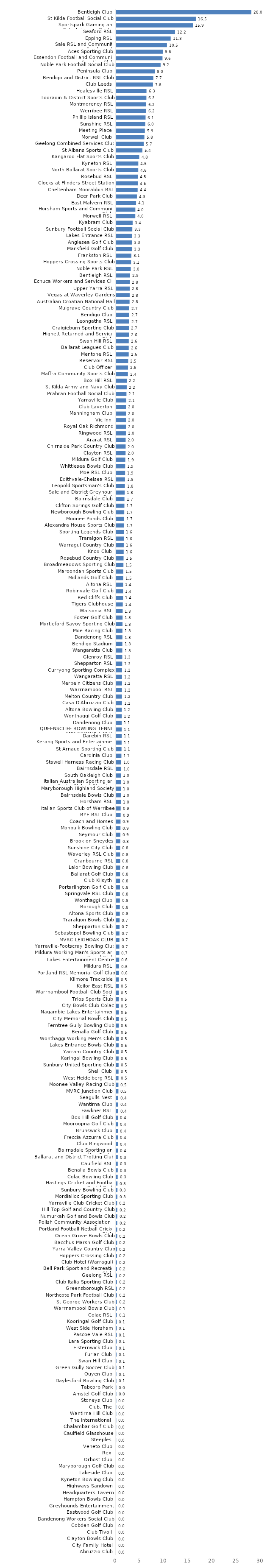
| Category | Series 0 |
|---|---|
| Abruzzio Club | 0 |
| City Family Hotel | 0 |
| Clayton Bowls Club | 0 |
| Club Tivoli | 0 |
| Cobden Golf Club | 0 |
| Dandenong Workers Social Club | 0 |
| Eastwood Golf Club | 0 |
| Greyhounds Entertainment | 0 |
| Hampton Bowls Club | 0 |
| Headquarters Tavern | 0 |
| Highways Sandown | 0 |
| Kyneton Bowling Club | 0 |
| Lakeside Club | 0 |
| Maryborough Golf Club | 0 |
| Orbost Club | 0 |
| Rex | 0 |
| Veneto Club | 0 |
| Steeples | 0.014 |
| Caulfield Glasshouse | 0.015 |
| Chalambar Golf Club | 0.024 |
| The International  | 0.029 |
| Wantirna Hill Club | 0.031 |
| Club, The | 0.034 |
| Stoneys Club | 0.035 |
| Amstel Golf Club | 0.046 |
| Tabcorp Park | 0.049 |
| Daylesford Bowling Club | 0.052 |
| Ouyen Club | 0.052 |
| Green Gully Soccer Club | 0.059 |
| Swan Hill Club | 0.068 |
| Furlan Club | 0.082 |
| Elsternwick Club | 0.091 |
| Lara Sporting Club | 0.111 |
| Pascoe Vale RSL | 0.124 |
| West Side Horsham | 0.124 |
| Kooringal Golf Club | 0.129 |
| Colac RSL | 0.134 |
| Warrnambool Bowls Club | 0.14 |
| St George Workers Club | 0.158 |
| Northcote Park Football Club | 0.158 |
| Greensborough RSL | 0.161 |
| Club Italia Sporting Club | 0.162 |
| Geelong RSL | 0.174 |
| Bell Park Sport and Recreation Club | 0.175 |
| Club Hotel (Warragul) | 0.177 |
| Hoppers Crossing Club | 0.186 |
| Yarra Valley Country Club | 0.197 |
| Bacchus Marsh Golf Club | 0.205 |
| Ocean Grove Bowls Club | 0.215 |
| Portland Football Netball Cricket Club | 0.219 |
| Polish Community Association in Geelong | 0.229 |
| Numurkah Golf and Bowls Club | 0.237 |
| Hill Top Golf and Country Club | 0.239 |
| Yarraville Club Cricket Club | 0.2 |
| Mordialloc Sporting Club | 0.257 |
| Sunbury Bowling Club | 0.275 |
| Hastings Cricket and Football Social Club | 0.278 |
| Colac Bowling Club | 0.319 |
| Benalla Bowls Club | 0.329 |
| Caulfield RSL | 0.33 |
| Ballarat and District Trotting Club | 0.34 |
| Bairnsdale Sporting and Convention Centre | 0.358 |
| Club Ringwood | 0.359 |
| Freccia Azzurra Club | 0.362 |
| Brunswick Club | 0.368 |
| Mooroopna Golf Club | 0.381 |
| Box Hill Golf Club | 0.385 |
| Fawkner RSL | 0.405 |
| Wantirna Club | 0.43 |
| Seagulls Nest | 0.433 |
| MVRC Junction Club | 0.471 |
| Moonee Valley Racing Club | 0.471 |
| West Heidelberg RSL | 0.484 |
| Shell Club | 0.495 |
| Sunbury United Sporting Club | 0.505 |
| Karingal Bowling Club | 0.512 |
| Yarram Country Club | 0.517 |
| Lakes Entrance Bowls Club | 0.519 |
| Wonthaggi Working Men's Club | 0.527 |
| Benalla Golf Club | 0.5 |
| Ferntree Gully Bowling Club | 0.53 |
| City Memorial Bowls Club | 0.534 |
| Nagambie Lakes Entertainment Centre | 0.536 |
| City Bowls Club Colac | 0.537 |
| Trios Sports Club | 0.542 |
| Warrnambool Football Club Social Club | 0.543 |
| Keilor East RSL | 0.545 |
| Kilmore Trackside | 0.547 |
| Portland RSL Memorial Golf Club | 0.601 |
| Mildura RSL | 0.611 |
| Lakes Entertainment Centre | 0.634 |
| Mildura Working Man's Sports and Social Club | 0.653 |
| Yarraville-Footscray Bowling Club | 0.666 |
| MVRC LEIGHOAK CLUB | 0.683 |
| Sebastopol Bowling Club | 0.688 |
| Shepparton Club | 0.709 |
| Traralgon Bowls Club | 0.721 |
| Altona Sports Club | 0.755 |
| Borough Club | 0.756 |
| Wonthaggi Club | 0.772 |
| Springvale RSL Club | 0.775 |
| Portarlington Golf Club | 0.786 |
| Club Kilsyth | 0.799 |
| Ballarat Golf Club | 0.807 |
| Lalor Bowling Club | 0.822 |
| Cranbourne RSL | 0.822 |
| Waverley RSL Club | 0.824 |
| Sunshine City Club | 0.826 |
| Brook on Sneydes | 0.85 |
| Seymour Club | 0.879 |
| Monbulk Bowling Club | 0.893 |
| Coach and Horses | 0.911 |
| RYE RSL Club | 0.931 |
| Italian Sports Club of Werribee | 0.935 |
| Horsham RSL | 0.981 |
| Bairnsdale Bowls Club | 0.985 |
| Maryborough Highland Society | 0.986 |
| Italian Australian Sporting and Social Club of Gippsland | 0.993 |
| South Oakleigh Club | 1 |
| Bairnsdale RSL | 1.026 |
| Stawell Harness Racing Club | 1.048 |
| Cardinia Club | 1.086 |
| St Arnaud Sporting Club | 1.111 |
| Kerang Sports and Entertainment Venue | 1.128 |
| Darebin RSL | 1.142 |
| QUEENSCLIFF BOWLING TENNIS AND CROQUET CLUB | 1.146 |
| Dandenong Club | 1.147 |
| Wonthaggi Golf Club | 1.16 |
| Altona Bowling Club | 1.173 |
| Casa D'Abruzzio Club | 1.192 |
| Melton Country Club | 1.2 |
| Warrnambool RSL | 1.211 |
| Merbein Citizens Club | 1.215 |
| Wangaratta RSL | 1.216 |
| Curryong Sporting Complex | 1.227 |
| Shepparton RSL | 1.257 |
| Glenroy RSL | 1.269 |
| Wangaratta Club | 1.276 |
| Bendigo Stadium | 1.287 |
| Dandenong RSL | 1.295 |
| Moe Racing Club | 1.301 |
| Myrtleford Savoy Sporting Club | 1.315 |
| Foster Golf Club | 1.329 |
| Watsonia RSL | 1.344 |
| Tigers Clubhouse | 1.369 |
| Red Cliffs Club | 1.442 |
| Robinvale Golf Club | 1.443 |
| Altona RSL | 1.444 |
| Midlands Golf Club | 1.472 |
| Maroondah Sports Club | 1.486 |
| Broadmeadows Sporting Club | 1.51 |
| Rosebud Country Club | 1.537 |
| Knox Club | 1.558 |
| Warragul Country Club | 1.575 |
| Traralgon RSL | 1.579 |
| Sporting Legends Club | 1.616 |
| Alexandra House Sports Club | 1.655 |
| Moonee Ponds Club | 1.666 |
| Newborough Bowling Club | 1.68 |
| Clifton Springs Golf Club | 1.707 |
| Bairnsdale Club | 1.72 |
| Sale and District Greyhound Racing Club | 1.77 |
| Leopold Sportsman's Club | 1.809 |
| Edithvale-Chelsea RSL | 1.83 |
| Moe RSL Club | 1.86 |
| Whittlesea Bowls Club | 1.87 |
| Mildura Golf Club | 1.897 |
| Clayton RSL | 1.95 |
| Chirnside Park Country Club | 1.964 |
| Ararat RSL | 1.965 |
| Ringwood RSL | 2.012 |
| Royal Oak Richmond | 2.029 |
| Vic Inn | 2.029 |
| Manningham Club | 2.029 |
| Club Laverton | 2.03 |
| Yarraville Club | 2.095 |
| Prahran Football Social Club | 2.137 |
| St Kilda Army and Navy Club | 2.187 |
| Box Hill RSL | 2.195 |
| Maffra Community Sports Club | 2.432 |
| Club Officer | 2.461 |
| Reservoir RSL | 2.496 |
| Mentone RSL | 2.601 |
| Ballarat Leagues Club | 2.608 |
| Swan Hill RSL | 2.611 |
| Highett Returned and Services Club | 2.634 |
| Craigieburn Sporting Club | 2.664 |
| Leongatha RSL | 2.676 |
| Bendigo Club | 2.693 |
| Mulgrave Country Club | 2.694 |
| Australian Croatian National Hall | 2.778 |
| Vegas at Waverley Gardens | 2.799 |
| Upper Yarra RSL | 2.803 |
| Echuca Workers and Services Club | 2.816 |
| Bentleigh RSL | 2.894 |
| Noble Park RSL | 3.029 |
| Hoppers Crossing Sports Club | 3.092 |
| Frankston RSL | 3.145 |
| Mansfield Golf Club | 3.282 |
| Anglesea Golf Club | 3.282 |
| Lakes Entrance RSL | 3.285 |
| Sunbury Football Social Club | 3.348 |
| Kyabram Club | 3.411 |
| Morwell RSL | 3.965 |
| Horsham Sports and Community Club | 3.976 |
| East Malvern RSL | 4.128 |
| Deer Park Club | 4.294 |
| Cheltenham Moorabbin RSL | 4.447 |
| Clocks at Flinders Street Station | 4.473 |
| Rosebud RSL | 4.501 |
| North Ballarat Sports Club | 4.578 |
| Kyneton RSL | 4.589 |
| Kangaroo Flat Sports Club | 4.783 |
| St Albans Sports Club | 5.428 |
| Geelong Combined Services Club | 5.698 |
| Morwell Club | 5.846 |
| Meeting Place | 5.942 |
| Sunshine RSL | 6.029 |
| Phillip Island RSL | 6.091 |
| Werribee RSL | 6.197 |
| Montmorency RSL | 6.218 |
| Tooradin & District Sports Club | 6.26 |
| Healesville RSL | 6.279 |
| Club Leeds | 7.617 |
| Bendigo and District RSL Club | 7.7 |
| Peninsula Club | 8.002 |
| Noble Park Football Social Club | 9.198 |
| Essendon Football and Community Sporting Club | 9.593 |
| Aces Sporting Club | 9.648 |
| Sale RSL and Community Sub-branch | 10.515 |
| Epping RSL | 11.285 |
| Seaford RSL | 12.195 |
| Sportspark Gaming and Entertainment Centre | 15.917 |
| St Kilda Football Social Club | 16.49 |
| Bentleigh Club | 27.985 |